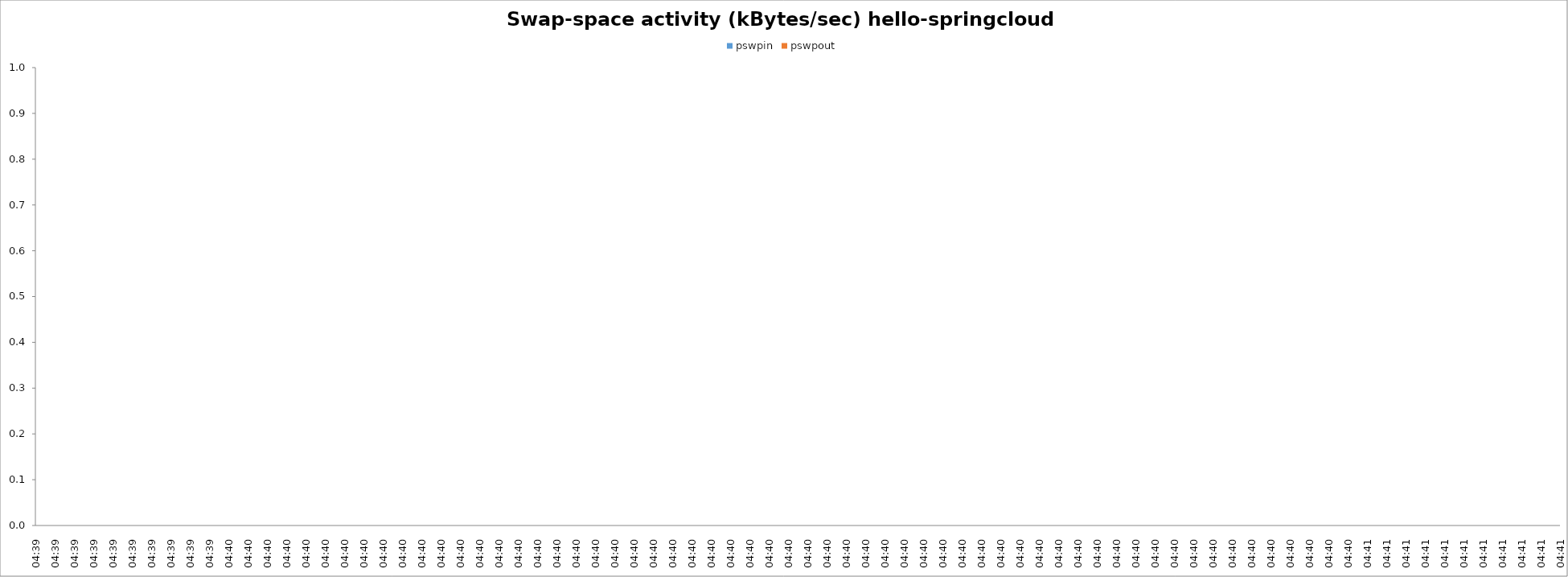
| Category | pswpin | pswpout |
|---|---|---|
| 04:39 | 0 | 0 |
| 04:39 | 0 | 0 |
| 04:39 | 0 | 0 |
| 04:39 | 0 | 0 |
| 04:39 | 0 | 0 |
| 04:39 | 0 | 0 |
| 04:39 | 0 | 0 |
| 04:39 | 0 | 0 |
| 04:39 | 0 | 0 |
| 04:39 | 0 | 0 |
| 04:40 | 0 | 0 |
| 04:40 | 0 | 0 |
| 04:40 | 0 | 0 |
| 04:40 | 0 | 0 |
| 04:40 | 0 | 0 |
| 04:40 | 0 | 0 |
| 04:40 | 0 | 0 |
| 04:40 | 0 | 0 |
| 04:40 | 0 | 0 |
| 04:40 | 0 | 0 |
| 04:40 | 0 | 0 |
| 04:40 | 0 | 0 |
| 04:40 | 0 | 0 |
| 04:40 | 0 | 0 |
| 04:40 | 0 | 0 |
| 04:40 | 0 | 0 |
| 04:40 | 0 | 0 |
| 04:40 | 0 | 0 |
| 04:40 | 0 | 0 |
| 04:40 | 0 | 0 |
| 04:40 | 0 | 0 |
| 04:40 | 0 | 0 |
| 04:40 | 0 | 0 |
| 04:40 | 0 | 0 |
| 04:40 | 0 | 0 |
| 04:40 | 0 | 0 |
| 04:40 | 0 | 0 |
| 04:40 | 0 | 0 |
| 04:40 | 0 | 0 |
| 04:40 | 0 | 0 |
| 04:40 | 0 | 0 |
| 04:40 | 0 | 0 |
| 04:40 | 0 | 0 |
| 04:40 | 0 | 0 |
| 04:40 | 0 | 0 |
| 04:40 | 0 | 0 |
| 04:40 | 0 | 0 |
| 04:40 | 0 | 0 |
| 04:40 | 0 | 0 |
| 04:40 | 0 | 0 |
| 04:40 | 0 | 0 |
| 04:40 | 0 | 0 |
| 04:40 | 0 | 0 |
| 04:40 | 0 | 0 |
| 04:40 | 0 | 0 |
| 04:40 | 0 | 0 |
| 04:40 | 0 | 0 |
| 04:40 | 0 | 0 |
| 04:40 | 0 | 0 |
| 04:40 | 0 | 0 |
| 04:40 | 0 | 0 |
| 04:40 | 0 | 0 |
| 04:40 | 0 | 0 |
| 04:40 | 0 | 0 |
| 04:40 | 0 | 0 |
| 04:40 | 0 | 0 |
| 04:40 | 0 | 0 |
| 04:40 | 0 | 0 |
| 04:40 | 0 | 0 |
| 04:41 | 0 | 0 |
| 04:41 | 0 | 0 |
| 04:41 | 0 | 0 |
| 04:41 | 0 | 0 |
| 04:41 | 0 | 0 |
| 04:41 | 0 | 0 |
| 04:41 | 0 | 0 |
| 04:41 | 0 | 0 |
| 04:41 | 0 | 0 |
| 04:41 | 0 | 0 |
| 04:41 | 0 | 0 |